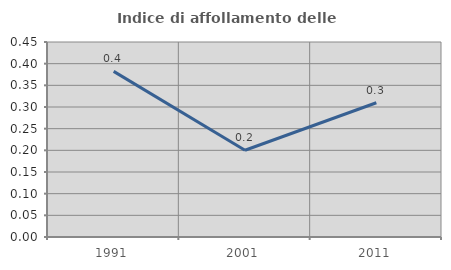
| Category | Indice di affollamento delle abitazioni  |
|---|---|
| 1991.0 | 0.382 |
| 2001.0 | 0.2 |
| 2011.0 | 0.31 |